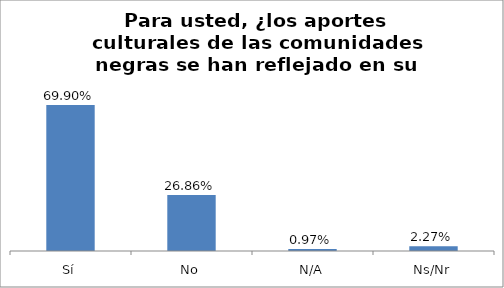
| Category | Total |
|---|---|
| Sí | 0.699 |
| No | 0.269 |
| N/A | 0.01 |
| Ns/Nr | 0.023 |